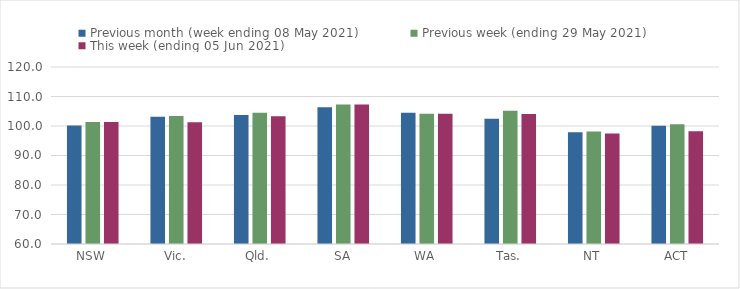
| Category | Previous month (week ending 08 May 2021) | Previous week (ending 29 May 2021) | This week (ending 05 Jun 2021) |
|---|---|---|---|
| NSW | 100.14 | 101.32 | 101.32 |
| Vic. | 103.16 | 103.38 | 101.31 |
| Qld. | 103.72 | 104.48 | 103.33 |
| SA | 106.37 | 107.32 | 107.32 |
| WA | 104.5 | 104.13 | 104.13 |
| Tas. | 102.47 | 105.19 | 104.09 |
| NT | 97.88 | 98.15 | 97.5 |
| ACT | 100.07 | 100.57 | 98.18 |